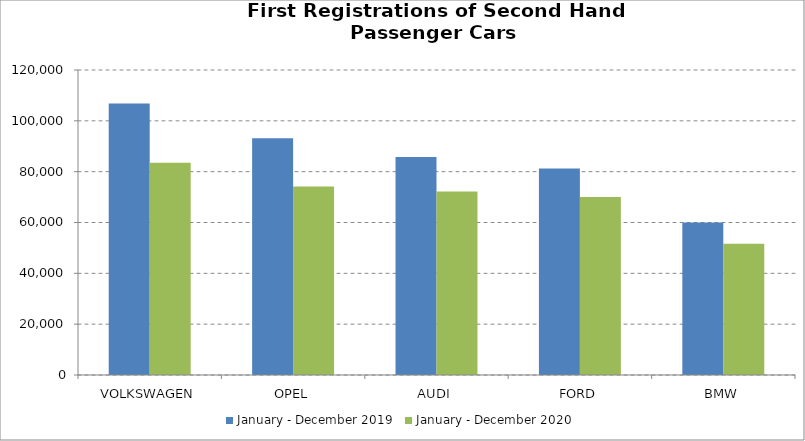
| Category | January - December 2019 | January - December 2020 |
|---|---|---|
| VOLKSWAGEN | 106822 | 83505 |
| OPEL | 93158 | 74148 |
| AUDI | 85811 | 72169 |
| FORD | 81269 | 70010 |
| BMW | 60032 | 51654 |